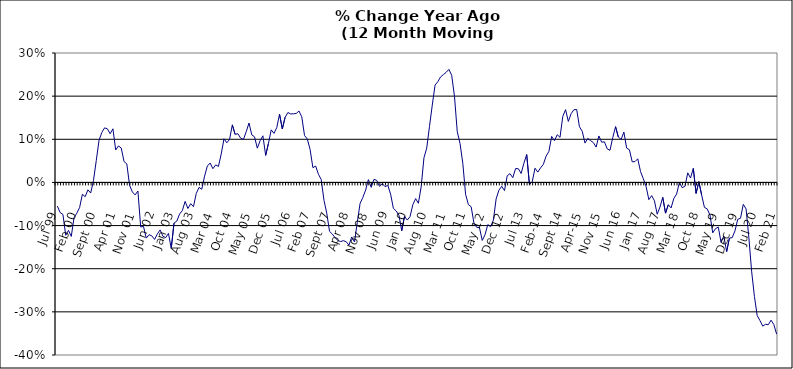
| Category | Series 0 |
|---|---|
| Jul 99 | -0.055 |
| Aug 99 | -0.07 |
| Sep 99 | -0.074 |
| Oct 99 | -0.123 |
| Nov 99 | -0.111 |
| Dec 99 | -0.125 |
| Jan 00 | -0.082 |
| Feb 00 | -0.071 |
| Mar 00 | -0.058 |
| Apr 00 | -0.027 |
| May 00 | -0.033 |
| Jun 00 | -0.017 |
| Jul 00 | -0.025 |
| Aug 00 | 0.005 |
| Sep 00 | 0.05 |
| Oct 00 | 0.098 |
| Nov 00 | 0.116 |
| Dec 00 | 0.127 |
| Jan 01 | 0.124 |
| Feb 01 | 0.113 |
| Mar 01 | 0.124 |
| Apr 01 | 0.075 |
| May 01 | 0.085 |
| Jun 01 | 0.08 |
| Jul 01 | 0.048 |
| Aug 01 | 0.043 |
| Sep 01 | -0.007 |
| Oct 01 | -0.022 |
| Nov 01 | -0.029 |
| Dec 01 | -0.02 |
| Jan 02 | -0.103 |
| Feb 02 | -0.102 |
| Mar 02 | -0.129 |
| Apr 02 | -0.121 |
| May 02 | -0.124 |
| Jun 02 | -0.132 |
| Jul 02 | -0.119 |
| Aug 02 | -0.11 |
| Sep 02 | -0.125 |
| Oct 02 | -0.128 |
| Nov 02 | -0.118 |
| Dec 02 | -0.153 |
| Jan 03 | -0.094 |
| Feb 03 | -0.09 |
| Mar 03 | -0.073 |
| Apr 03 | -0.065 |
| May 03 | -0.044 |
| Jun 03 | -0.06 |
| Jul 03 | -0.049 |
| Aug 03 | -0.056 |
| Sep 03 | -0.026 |
| Oct 03 | -0.012 |
| Nov 03 | -0.016 |
| Dec 03 | 0.014 |
| Jan 04 | 0.038 |
| Feb 04 | 0.045 |
| Mar 04 | 0.032 |
| Apr 04 | 0.041 |
| May 04 | 0.037 |
| Jun 04 | 0.066 |
| Jul 04 | 0.101 |
| Aug 04 | 0.092 |
| Sep 04 | 0.1 |
| Oct 04 | 0.133 |
| Nov 04 | 0.111 |
| Dec 04 | 0.113 |
| Jan 05 | 0.103 |
| Feb 05 | 0.1 |
| Mar 05 | 0.118 |
| Apr 05 | 0.138 |
| May 05 | 0.11 |
| Jun 05 | 0.106 |
| Jul 05 | 0.079 |
| Aug 05 | 0.097 |
| Sep 05 | 0.108 |
| Oct 05 | 0.063 |
| Nov 05 | 0.09 |
| Dec 05 | 0.122 |
| Jan 06 | 0.114 |
| Feb 06 | 0.127 |
| Mar 06 | 0.158 |
| Apr 06 | 0.124 |
| May 06 | 0.151 |
| Jun 06 | 0.162 |
| Jul 06 | 0.159 |
| Aug 06 | 0.159 |
| Sep 06 | 0.16 |
| Oct 06 | 0.166 |
| Nov 06 | 0.152 |
| Dec 06 | 0.109 |
| Jan 07 | 0.101 |
| Feb 07 | 0.076 |
| Mar 07 | 0.034 |
| Apr 07 | 0.038 |
| May 07 | 0.019 |
| Jun 07 | 0.007 |
| Jul 07 | -0.041 |
| Aug 07 | -0.071 |
| Sep 07 | -0.113 |
| Oct 07 | -0.12 |
| Nov 07 | -0.128 |
| Dec 07 | -0.135 |
| Jan 08 | -0.137 |
| Feb 08 | -0.135 |
| Mar 08 | -0.137 |
| Apr 08 | -0.145 |
| May 08 | -0.126 |
| Jun 08 | -0.138 |
| Jul 08 | -0.093 |
| Aug 08 | -0.049 |
| Sep-08 | -0.035 |
| Oct 08 | -0.018 |
| Nov 08 | 0.007 |
| Dec 08 | -0.011 |
| Jan 09 | 0.007 |
| Feb 09 | 0.005 |
| Mar 09 | -0.009 |
| Apr 09 | -0.003 |
| May 09 | -0.01 |
| Jun 09 | -0.007 |
| Jul 09 | -0.027 |
| Aug 09 | -0.06 |
| Sep 09 | -0.066 |
| Oct 09 | -0.076 |
| Nov 09 | -0.112 |
| Dec 09 | -0.079 |
| Jan 10 | -0.087 |
| Feb 10 | -0.079 |
| Mar 10 | -0.052 |
| Apr 10 | -0.037 |
| May 10 | -0.048 |
| Jun 10 | -0.01 |
| Jul 10 | 0.057 |
| Aug 10 | 0.08 |
| Sep 10 | 0.13 |
| Oct 10 | 0.179 |
| Nov 10 | 0.226 |
| Dec 10 | 0.233 |
| Jan 11 | 0.245 |
| Feb 11 | 0.25 |
| Mar 11 | 0.255 |
| Apr 11 | 0.262 |
| May 11 | 0.248 |
| Jun 11 | 0.199 |
| Jul 11 | 0.118 |
| Aug 11 | 0.09 |
| Sep 11 | 0.044 |
| Oct 11 | -0.028 |
| Nov 11 | -0.051 |
| Dec 11 | -0.056 |
| Jan 12 | -0.094 |
| Feb 12 | -0.104 |
| Mar 12 | -0.105 |
| Apr 12 | -0.134 |
| May 12 | -0.121 |
| Jun 12 | -0.098 |
| Jul 12 | -0.103 |
| Aug 12 | -0.087 |
| Sep 12 | -0.038 |
| Oct 12 | -0.018 |
| Nov 12 | -0.009 |
| Dec 12 | -0.019 |
| Jan 13 | 0.016 |
| Feb-13 | 0.02 |
| Mar-13 | 0.011 |
| Apr 13 | 0.032 |
| May 13 | 0.032 |
| Jun-13 | 0.021 |
| Jul 13 | 0.045 |
| Aug 13 | 0.065 |
| Sep 13 | -0.005 |
| Oct 13 | 0.002 |
| Nov 13 | 0.033 |
| Dec 13 | 0.024 |
| Jan 14 | 0.034 |
| Feb-14 | 0.042 |
| Mar 14 | 0.061 |
| Apr 14 | 0.072 |
| May 14 | 0.107 |
| Jun 14 | 0.097 |
| Jul-14 | 0.111 |
| Aug-14 | 0.105 |
| Sep 14 | 0.153 |
| Oct 14 | 0.169 |
| Nov 14 | 0.141 |
| Dec 14 | 0.159 |
| Jan 15 | 0.169 |
| Feb 15 | 0.169 |
| Mar 15 | 0.129 |
| Apr-15 | 0.118 |
| May 15 | 0.091 |
| Jun-15 | 0.102 |
| Jul 15 | 0.097 |
| Aug 15 | 0.092 |
| Sep 15 | 0.082 |
| Oct 15 | 0.108 |
| Nov 15 | 0.093 |
| Dec 15 | 0.094 |
| Jan 16 | 0.078 |
| Feb 16 | 0.075 |
| Mar 16 | 0.104 |
| Apr 16 | 0.129 |
| May 16 | 0.105 |
| Jun 16 | 0.1 |
| Jul 16 | 0.117 |
| Aug 16 | 0.08 |
| Sep 16 | 0.076 |
| Oct 16 | 0.048 |
| Nov 16 | 0.048 |
| Dec 16 | 0.055 |
| Jan 17 | 0.025 |
| Feb 17 | 0.009 |
| Mar 17 | -0.01 |
| Apr 17 | -0.04 |
| May 17 | -0.031 |
| Jun 17 | -0.042 |
| Jul 17 | -0.074 |
| Aug 17 | -0.057 |
| Sep 17 | -0.035 |
| Oct 17 | -0.071 |
| Nov 17 | -0.052 |
| Dec 17 | -0.059 |
| Jan 18 | -0.037 |
| Feb 18 | -0.027 |
| Mar 18 | 0 |
| Apr 18 | -0.012 |
| May 18 | -0.009 |
| Jun 18 | 0.022 |
| Jul 18 | 0.01 |
| Aug 18 | 0.033 |
| Sep 18 | -0.025 |
| Oct 18 | 0.002 |
| Nov 18 | -0.029 |
| Dec 18 | -0.058 |
| Jan 19 | -0.061 |
| Feb 19 | -0.075 |
| Mar 19 | -0.117 |
| Apr 19 | -0.107 |
| May 19 | -0.104 |
| Jun 19 | -0.139 |
| Jul 19 | -0.124 |
| Aug 19 | -0.16 |
| Sep 19 | -0.129 |
| Oct 19 | -0.128 |
| Nov 19 | -0.112 |
| Dec 19 | -0.085 |
| Jan 20 | -0.083 |
| Feb 20 | -0.051 |
| Mar 20 | -0.061 |
| Apr 20 | -0.127 |
| May 20 | -0.206 |
| Jun 20 | -0.264 |
| Jul 20 | -0.308 |
| Aug 20 | -0.32 |
| Sep 20 | -0.333 |
| Oct 20 | -0.329 |
| Nov 20 | -0.33 |
| Dec 20 | -0.319 |
| Jan 21 | -0.329 |
| Feb 21 | -0.352 |